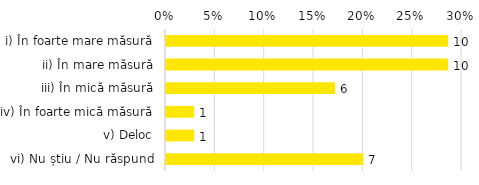
| Category | Total |
|---|---|
| i) În foarte mare măsură | 0.286 |
| ii) În mare măsură | 0.286 |
| iii) În mică măsură | 0.171 |
| iv) În foarte mică măsură | 0.029 |
| v) Deloc | 0.029 |
| vi) Nu știu / Nu răspund | 0.2 |